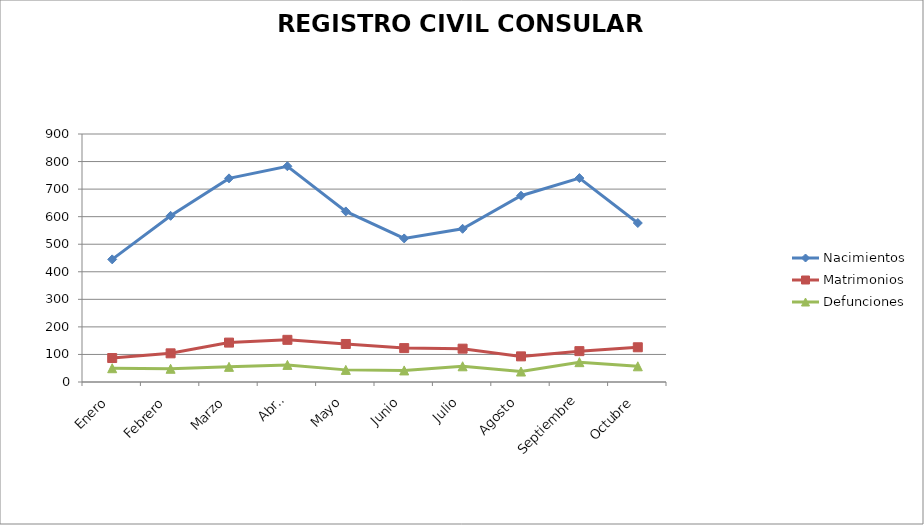
| Category | Nacimientos | Matrimonios | Defunciones |
|---|---|---|---|
| Enero | 445 | 87 | 50 |
| Febrero | 603 | 104 | 48 |
| Marzo | 739 | 143 | 55 |
| Abril | 783 | 153 | 62 |
| Mayo | 619 | 138 | 44 |
| Junio | 521 | 123 | 42 |
| Julio | 556 | 121 | 57 |
| Agosto | 676 | 93 | 38 |
| Septiembre | 740 | 112 | 72 |
| Octubre | 577 | 126 | 57 |